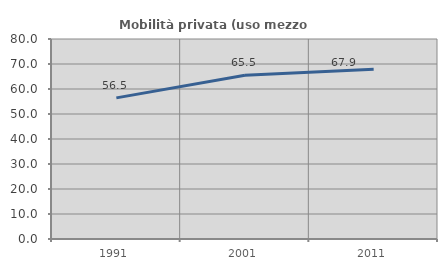
| Category | Mobilità privata (uso mezzo privato) |
|---|---|
| 1991.0 | 56.458 |
| 2001.0 | 65.529 |
| 2011.0 | 67.925 |